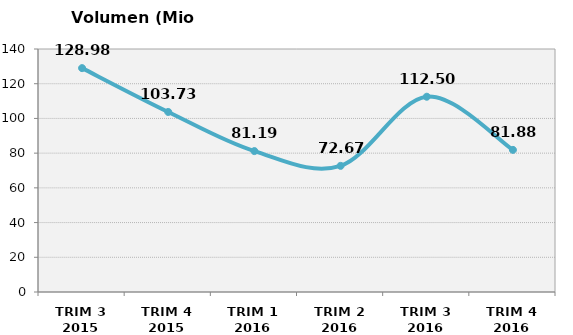
| Category | Volumen (Mio consumiciones) |
|---|---|
| TRIM 3 2015 | 128.98 |
| TRIM 4 2015 | 103.727 |
| TRIM 1 2016 | 81.186 |
| TRIM 2 2016 | 72.673 |
| TRIM 3 2016 | 112.501 |
| TRIM 4 2016 | 81.88 |